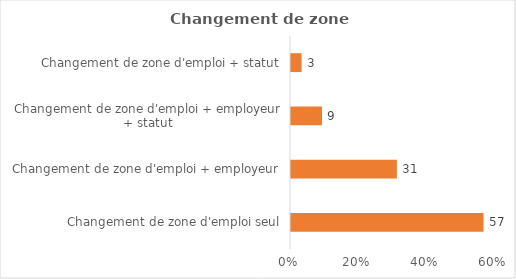
| Category | Series 0 |
|---|---|
| Changement de zone d'emploi seul | 56.618 |
| Changement de zone d'emploi + employeur | 31.146 |
| Changement de zone d'emploi + employeur + statut | 9.13 |
| Changement de zone d'emploi + statut | 3.106 |